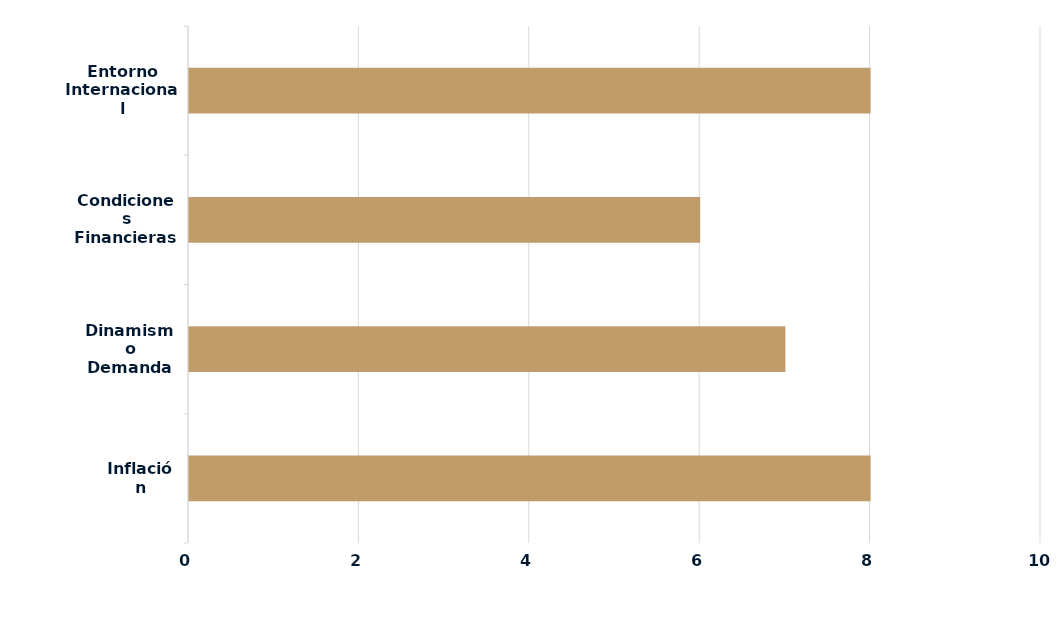
| Category | Series 0 |
|---|---|
| Inflación | 8 |
| Dinamismo Demanda | 7 |
| Condiciones Financieras Locales | 6 |
| Entorno Internacional | 8 |